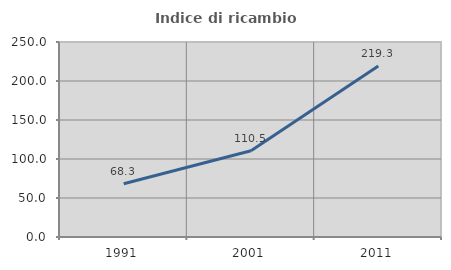
| Category | Indice di ricambio occupazionale  |
|---|---|
| 1991.0 | 68.281 |
| 2001.0 | 110.487 |
| 2011.0 | 219.289 |